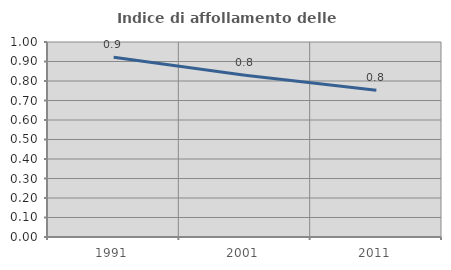
| Category | Indice di affollamento delle abitazioni  |
|---|---|
| 1991.0 | 0.922 |
| 2001.0 | 0.83 |
| 2011.0 | 0.753 |